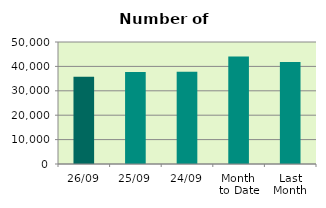
| Category | Series 0 |
|---|---|
| 26/09 | 35726 |
| 25/09 | 37720 |
| 24/09 | 37846 |
| Month 
to Date | 44008.105 |
| Last
Month | 41849.545 |